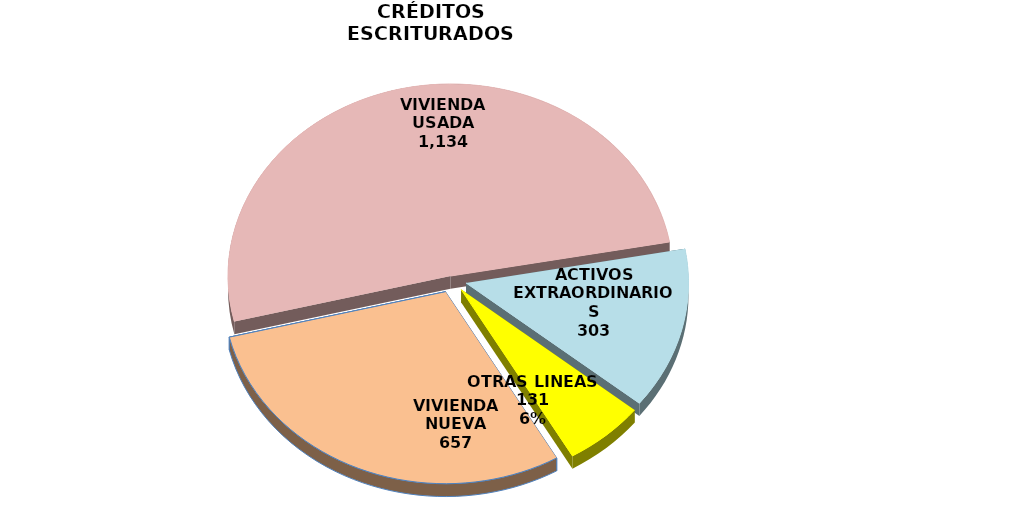
| Category | Series 0 |
|---|---|
| VIVIENDA NUEVA | 657 |
| VIVIENDA USADA | 1134 |
| ACTIVOS EXTRAORDINARIOS | 303 |
| OTRAS LINEAS | 131 |